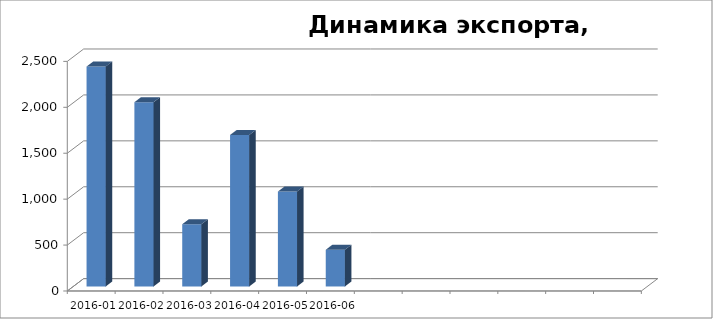
| Category | Масса, тонн |
|---|---|
| 2016-01 | 2394.551 |
| 2016-02 | 2006.374 |
| 2016-03 | 677.717 |
| 2016-04 | 1649.559 |
| 2016-05 | 1033.771 |
| 2016-06 | 399.83 |